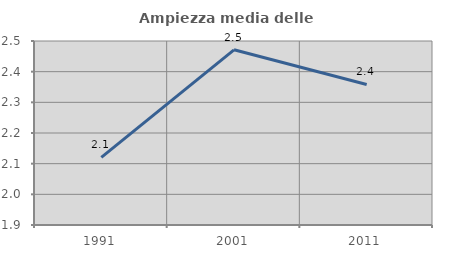
| Category | Ampiezza media delle famiglie |
|---|---|
| 1991.0 | 2.12 |
| 2001.0 | 2.471 |
| 2011.0 | 2.358 |